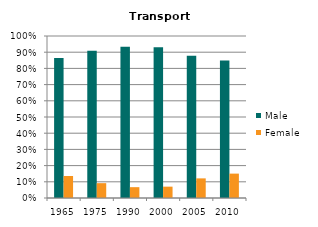
| Category | Male | Female |
|---|---|---|
| 1965.0 | 0.864 | 0.136 |
| 1975.0 | 0.908 | 0.092 |
| 1990.0 | 0.933 | 0.067 |
| 2000.0 | 0.93 | 0.07 |
| 2005.0 | 0.879 | 0.121 |
| 2010.0 | 0.849 | 0.151 |